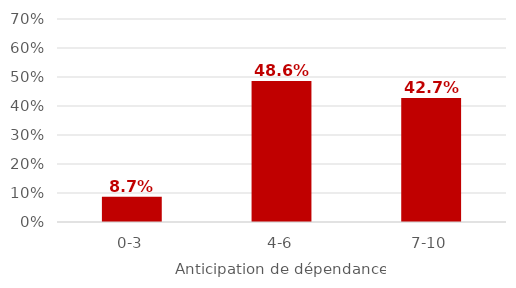
| Category | 40-79 ans |
|---|---|
| 0-3 | 0.087 |
| 4-6 | 0.486 |
| 7-10 | 0.427 |